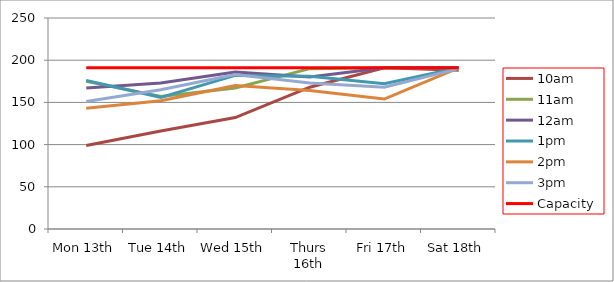
| Category | 9am | 10am | 11am | 12am | 1pm | 2pm | 3pm | 4pm | 5pm | Capacity |
|---|---|---|---|---|---|---|---|---|---|---|
| Mon 13th |  | 99 | 175 | 167 | 176 | 143 | 151 |  |  | 191 |
| Tue 14th |  | 116 | 157 | 173 | 156 | 152 | 165 |  |  | 191 |
| Wed 15th |  | 132 | 167 | 186 | 182 | 170 | 183 |  |  | 191 |
| Thurs 16th |  | 168 | 190 | 180 | 181 | 164 | 173 |  |  | 191 |
| Fri 17th |  | 191 | 191 | 191 | 172 | 154 | 168 |  |  | 191 |
| Sat 18th |  | 188 | 191 | 191 | 191 | 191 | 190 |  |  | 191 |